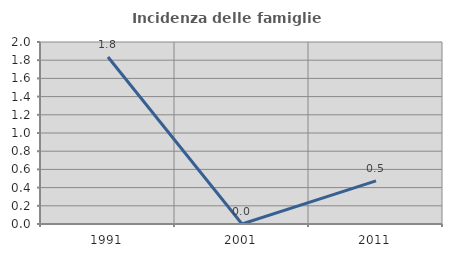
| Category | Incidenza delle famiglie numerose |
|---|---|
| 1991.0 | 1.835 |
| 2001.0 | 0 |
| 2011.0 | 0.474 |